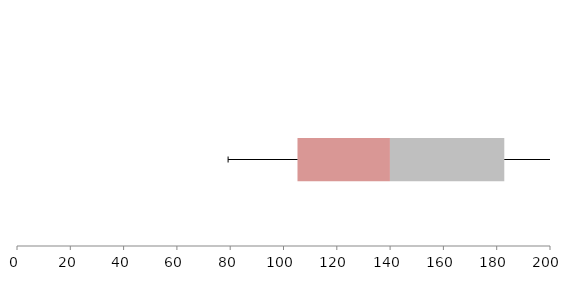
| Category | Series 1 | Series 2 | Series 3 |
|---|---|---|---|
| 0 | 105.25 | 34.689 | 42.908 |